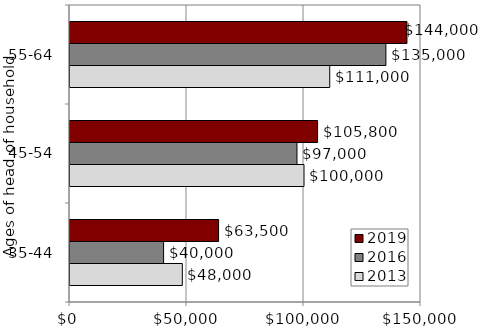
| Category | 2013 | 2016 | 2019 |
|---|---|---|---|
| 35-44 | 48000 | 40000 | 63500 |
| 45-54 | 100000 | 97000 | 105800 |
| 55-64 | 111000 | 135000 | 144000 |